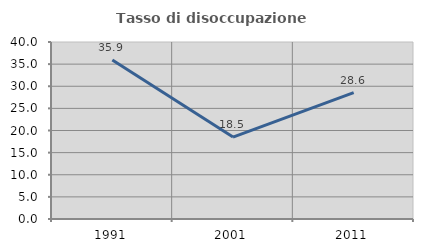
| Category | Tasso di disoccupazione giovanile  |
|---|---|
| 1991.0 | 35.938 |
| 2001.0 | 18.519 |
| 2011.0 | 28.571 |